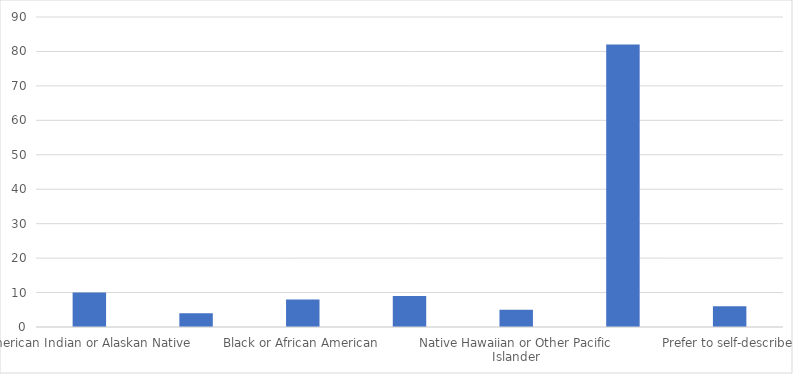
| Category | Number of Responses |
|---|---|
| American Indian or Alaskan Native | 10 |
| Asian | 4 |
| Black or African American | 8 |
| Hispanic or Latino/a/x | 9 |
| Native Hawaiian or Other Pacific Islander | 5 |
| White | 82 |
| Prefer to self-describe | 6 |